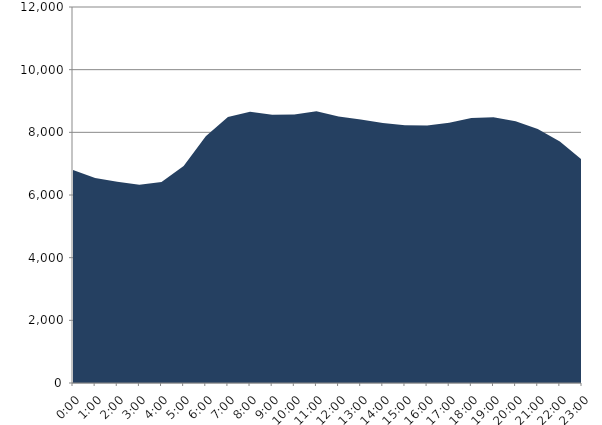
| Category | Series 0 | Series 1 |
|---|---|---|
| 2022-05-18 |  | 6800.54 |
| 2022-05-18 01:00:00 |  | 6544.28 |
| 2022-05-18 02:00:00 |  | 6425.44 |
| 2022-05-18 03:00:00 |  | 6328.97 |
| 2022-05-18 04:00:00 |  | 6412.25 |
| 2022-05-18 05:00:00 |  | 6923.97 |
| 2022-05-18 06:00:00 |  | 7872.32 |
| 2022-05-18 07:00:00 |  | 8491.7 |
| 2022-05-18 08:00:00 |  | 8655.25 |
| 2022-05-18 09:00:00 |  | 8564 |
| 2022-05-18 10:00:00 |  | 8571.95 |
| 2022-05-18 11:00:00 |  | 8676.75 |
| 2022-05-18 12:00:00 |  | 8507.2 |
| 2022-05-18 13:00:00 |  | 8411.47 |
| 2022-05-18 14:00:00 |  | 8297.8 |
| 2022-05-18 15:00:00 |  | 8229.66 |
| 2022-05-18 16:00:00 |  | 8216.87 |
| 2022-05-18 17:00:00 |  | 8308.17 |
| 2022-05-18 18:00:00 |  | 8458.03 |
| 2022-05-18 19:00:00 |  | 8480.14 |
| 2022-05-18 20:00:00 |  | 8351.33 |
| 2022-05-18 21:00:00 |  | 8104.71 |
| 2022-05-18 22:00:00 |  | 7706.56 |
| 2022-05-18 23:00:00 |  | 7125.28 |